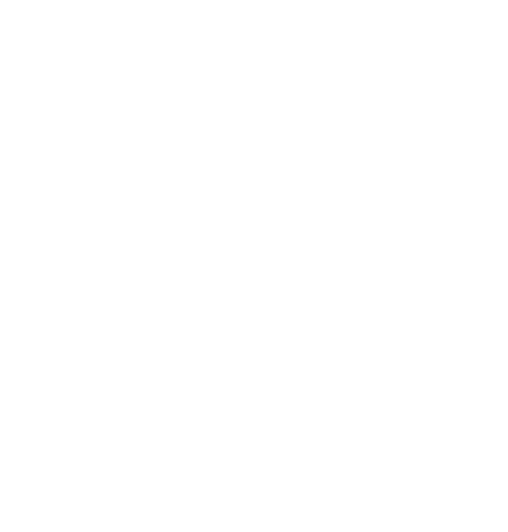
| Category | Series 0 |
|---|---|
| 1.1 Own Use | 0 |
| 1.2 Own Impacts | 0 |
| 1.3 External Factors | 0 |
| 1.4 Stakeholder Perceptions | 0 |
| 1.5 Suppliers | 0 |
| 1.6 Own Operations | 0 |
| 1.7 Supply Chain | 0 |
| 2.1 Board Oversight | 0 |
| 2.2 Senior Management | 0 |
| 2.3 Public Policy/Lobbying Positions | 0 |
| 2.4 Public Statement/Policy | 0 |
| 2.5 Goals/Standards for Withdrawals | 0 |
| 2.6 Wastewater Standards | 0 |
| 2.7 Watershed Risk Plans | 0 |
| 2.8 Supplier Standards/Practices | 0 |
| 2.9 Business Planning | 0 |
| 2.10 Product Design | 0 |
| 2.11 Opportunity Identification | 0 |
| 3.1 Local Communities | 0 |
| 3.2 Employees | 0 |
| 3.3 Suppliers | 0 |
| 3.4 Governments & Regulators | 0 |
| 3.5 NGOs & Community Groups | 0 |
| 3.6 Other Industries | 0 |
| 3.7 Customers & Consumers | 0 |
| 4.1 Water Related Information | 0 |
| 4.2 Financial Filings | 0 |
| 4.3 Auditing/Assurance | 0 |